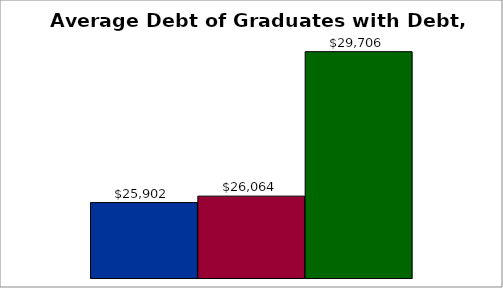
| Category | 50 states and D.C. | SREB states | State |
|---|---|---|---|
| 0 | 25902 | 26063.812 | 29706 |